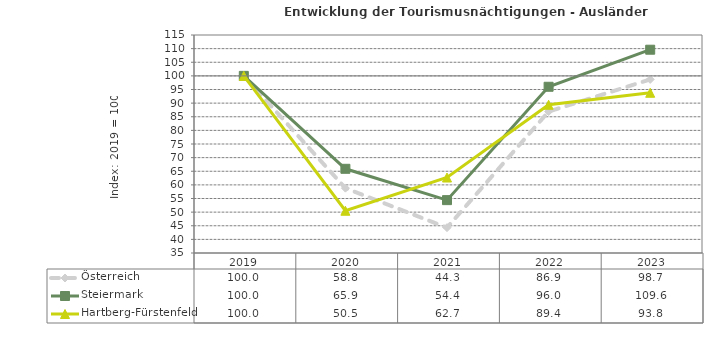
| Category | Österreich | Steiermark | Hartberg-Fürstenfeld |
|---|---|---|---|
| 2023.0 | 98.7 | 109.6 | 93.8 |
| 2022.0 | 86.9 | 96 | 89.4 |
| 2021.0 | 44.3 | 54.4 | 62.7 |
| 2020.0 | 58.8 | 65.9 | 50.5 |
| 2019.0 | 100 | 100 | 100 |